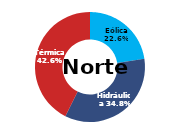
| Category | Norte |
|---|---|
| Eólica | 64.466 |
| Hidráulica | 99.201 |
| Solar | 0 |
| Térmica | 121.514 |